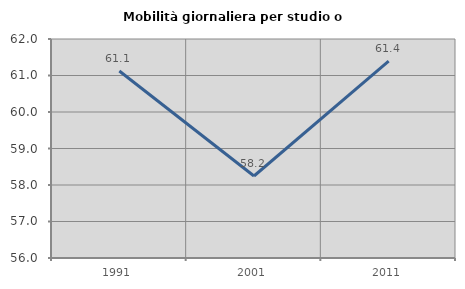
| Category | Mobilità giornaliera per studio o lavoro |
|---|---|
| 1991.0 | 61.122 |
| 2001.0 | 58.247 |
| 2011.0 | 61.396 |